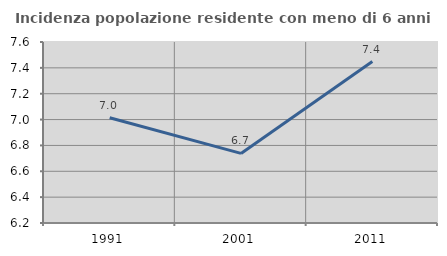
| Category | Incidenza popolazione residente con meno di 6 anni |
|---|---|
| 1991.0 | 7.014 |
| 2001.0 | 6.738 |
| 2011.0 | 7.449 |